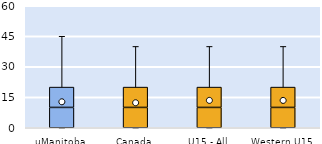
| Category | 25th | 50th | 75th |
|---|---|---|---|
| uManitoba | 0 | 10 | 10 |
| Canada | 0 | 10 | 10 |
| U15 - All | 0 | 10 | 10 |
| Western U15 | 0 | 10 | 10 |